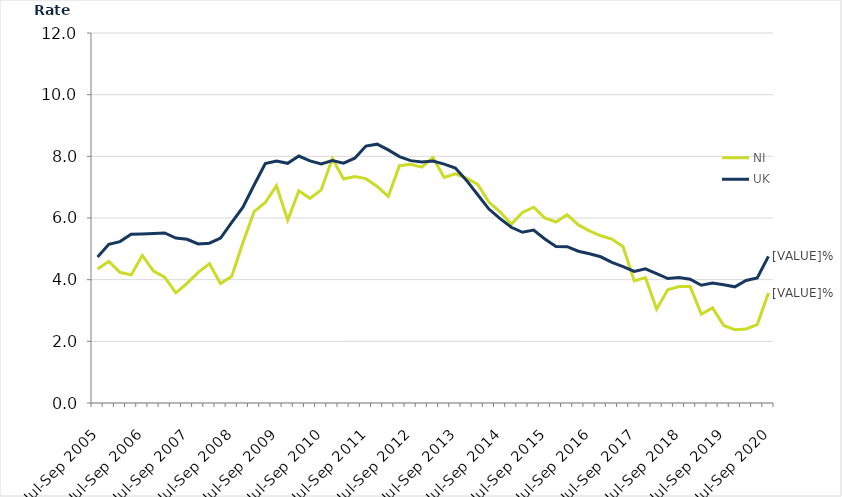
| Category | NI | UK |
|---|---|---|
| Jul-Sep 2005 | 4.343 | 4.732 |
| Oct-Dec 2005 | 4.589 | 5.146 |
| Jan-Mar 2006 | 4.239 | 5.234 |
| Apr-Jun 2006 | 4.155 | 5.472 |
| Jul-Sep 2006 | 4.785 | 5.484 |
| Oct-Dec 2006 | 4.279 | 5.501 |
| Jan-Mar 2007 | 4.084 | 5.514 |
| Apr-Jun 2007 | 3.573 | 5.35 |
| Jul-Sep 2007 | 3.881 | 5.31 |
| Oct-Dec 2007 | 4.234 | 5.157 |
| Jan-Mar 2008 | 4.52 | 5.183 |
| Apr-Jun 2008 | 3.873 | 5.35 |
| Jul-Sep 2008 | 4.111 | 5.855 |
| Oct-Dec 2008 | 5.202 | 6.353 |
| Jan-Mar 2009 | 6.205 | 7.072 |
| Apr-Jun 2009 | 6.503 | 7.764 |
| Jul-Sep 2009 | 7.048 | 7.847 |
| Oct-Dec 2009 | 5.928 | 7.773 |
| Jan-Mar 2010 | 6.881 | 8.01 |
| Apr-Jun 2010 | 6.638 | 7.852 |
| Jul-Sep 2010 | 6.912 | 7.755 |
| Oct-Dec 2010 | 7.928 | 7.863 |
| Jan-Mar 2011 | 7.263 | 7.778 |
| Apr-Jun 2011 | 7.346 | 7.94 |
| Jul-Sep 2011 | 7.276 | 8.333 |
| Oct-Dec 2011 | 7.024 | 8.394 |
| Jan-Mar 2012 | 6.703 | 8.21 |
| Apr-Jun 2012 | 7.696 | 7.992 |
| Jul-Sep 2012 | 7.741 | 7.86 |
| Oct-Dec 2012 | 7.647 | 7.814 |
| Jan-Mar 2013 | 7.957 | 7.845 |
| Apr-Jun 2013 | 7.315 | 7.748 |
| Jul-Sep 2013 | 7.429 | 7.618 |
| Oct-Dec 2013 | 7.293 | 7.221 |
| Jan-Mar 2014 | 7.089 | 6.755 |
| Apr-Jun 2014 | 6.515 | 6.289 |
| Jul-Sep 2014 | 6.203 | 5.981 |
| Oct-Dec 2014 | 5.795 | 5.699 |
| Jan-Mar 2015 | 6.182 | 5.536 |
| Apr-Jun 2015 | 6.349 | 5.609 |
| Jul-Sep 2015 | 6.002 | 5.319 |
| Oct-Dec 2015 | 5.871 | 5.079 |
| Jan-Mar 2016 | 6.107 | 5.071 |
| Apr-Jun 2016 | 5.775 | 4.921 |
| Jul-Sep 2016 | 5.583 | 4.839 |
| Oct-Dec 2016 | 5.424 | 4.742 |
| Jan-Mar 2017 | 5.315 | 4.563 |
| Apr-Jun 2017 | 5.068 | 4.425 |
| Jul-Sep 2017 | 3.958 | 4.267 |
| Oct-Dec 2017 | 4.065 | 4.352 |
| Jan-Mar 2018 | 3.043 | 4.198 |
| Apr-Jun 2018 | 3.67 | 4.037 |
| Jul-Sep 2018 | 3.776 | 4.073 |
| Oct-Dec 2018 | 3.776 | 4.014 |
| Jan-Mar 2019 | 2.88 | 3.818 |
| Apr-Jun 2019 | 3.085 | 3.893 |
| Jul-Sep 2019 | 2.516 | 3.833 |
| Oct-Dec 2019 | 2.376 | 3.769 |
| Jan-Mar 2020 | 2.401 | 3.972 |
| Apr-Jun 2020 | 2.544 | 4.055 |
| Jul-Sep 2020 | 3.564 | 4.757 |